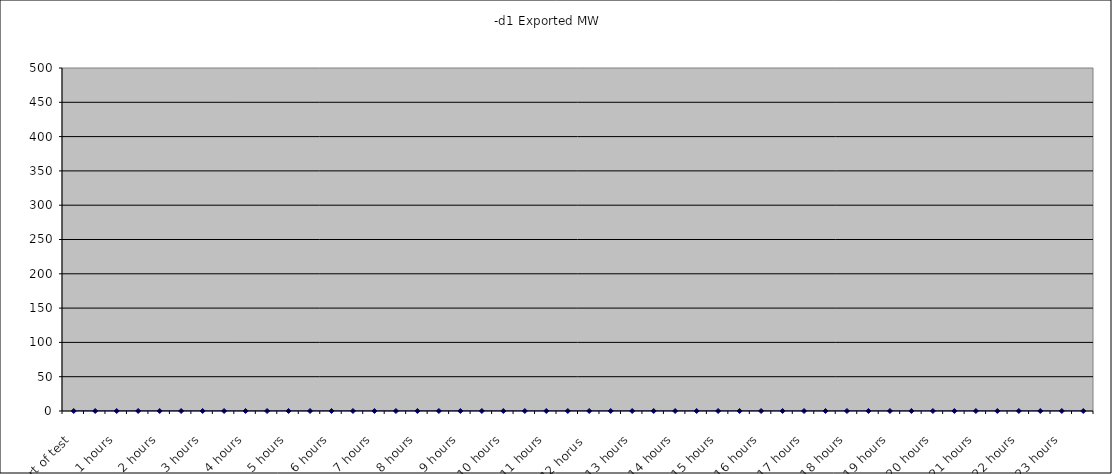
| Category | Exported MW |
|---|---|
| Start of test | 0 |
| 0.5 hours | 0 |
| 1 hours | 0 |
| 1.5 hours | 0 |
| 2 hours | 0 |
| 2.5 hours | 0 |
| 3 hours | 0 |
| 3.5 hours | 0 |
| 4 hours | 0 |
| 4.5 hours | 0 |
| 5 hours | 0 |
| 5.5 hours | 0 |
| 6 hours | 0 |
| 6.5 hours | 0 |
| 7 hours | 0 |
| 7.5 hours | 0 |
| 8 hours | 0 |
| 8.5 hours | 0 |
| 9 hours | 0 |
| 9.5 hours | 0 |
| 10 hours | 0 |
| 10.5 hours | 0 |
| 11 hours | 0 |
|  11.5 hours | 0 |
| 12 horus  | 0 |
| 12.5 hours | 0 |
| 13 hours | 0 |
| 13.5 hours | 0 |
| 14 hours | 0 |
| 14.5 hours | 0 |
| 15 hours | 0 |
| 15.5 hours | 0 |
| 16 hours | 0 |
| 16.5 hours | 0 |
| 17 hours | 0 |
| 17.5 hours | 0 |
| 18 hours | 0 |
| 18.5 hours | 0 |
| 19 hours | 0 |
| 19.5 hours | 0 |
| 20 hours | 0 |
| 20.5 hours | 0 |
| 21 hours | 0 |
| 21.5 hours | 0 |
| 22 hours | 0 |
| 22.5 hours | 0 |
| 23 hours | 0 |
| 23.5 hours | 0 |